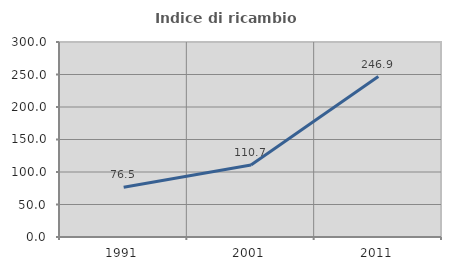
| Category | Indice di ricambio occupazionale  |
|---|---|
| 1991.0 | 76.515 |
| 2001.0 | 110.664 |
| 2011.0 | 246.908 |